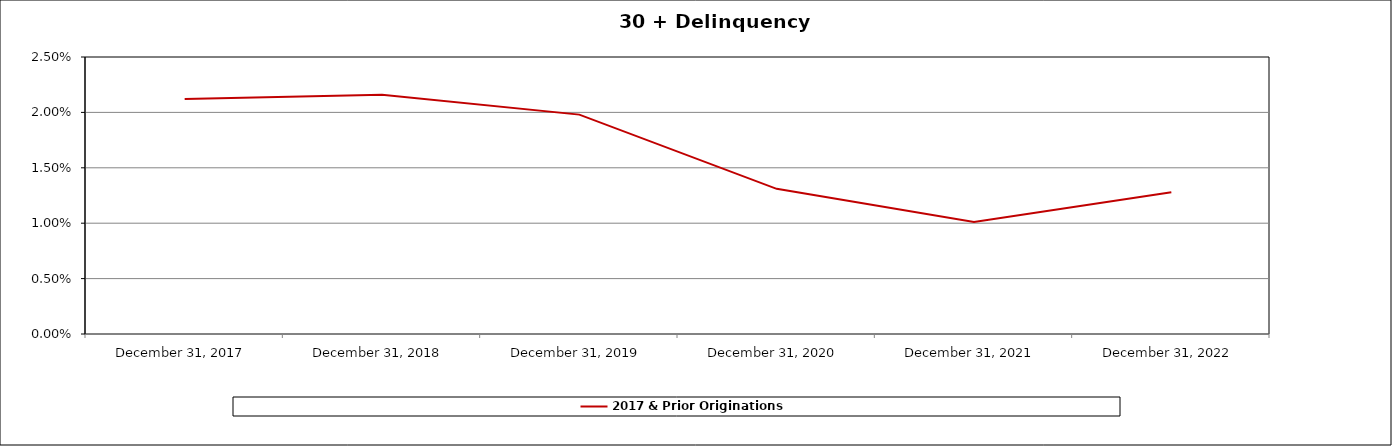
| Category | 2017 & Prior Originations |
|---|---|
| 2017-12-31 | 0.021 |
| 2018-12-31 | 0.022 |
| 2019-12-31 | 0.02 |
| 2020-12-31 | 0.013 |
| 2021-12-31 | 0.01 |
| 2022-12-31 | 0.013 |